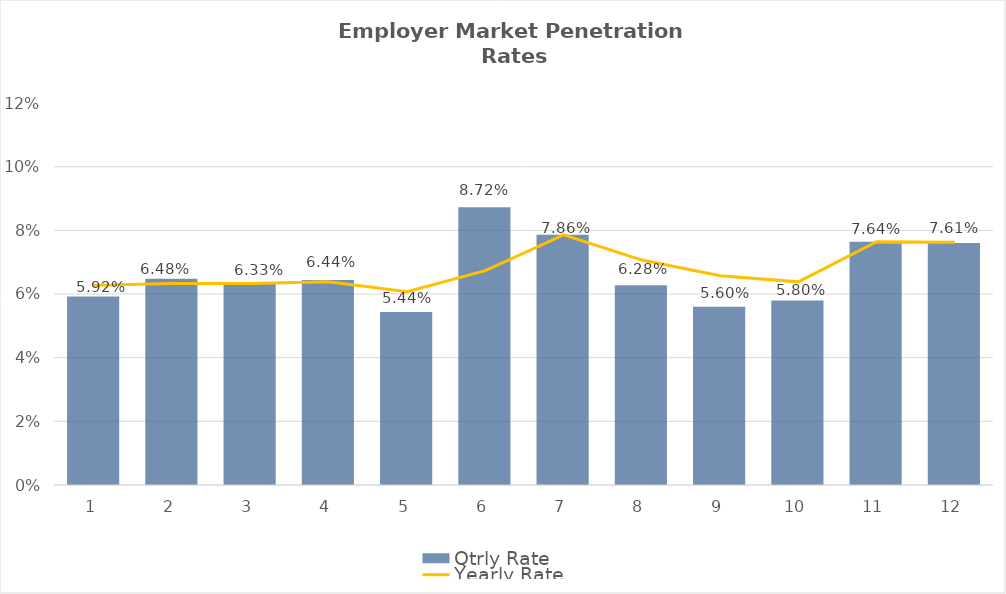
| Category | Qtrly Rate |
|---|---|
| 0 | 0.059 |
| 1 | 0.065 |
| 2 | 0.063 |
| 3 | 0.064 |
| 4 | 0.054 |
| 5 | 0.087 |
| 6 | 0.079 |
| 7 | 0.063 |
| 8 | 0.056 |
| 9 | 0.058 |
| 10 | 0.076 |
| 11 | 0.076 |